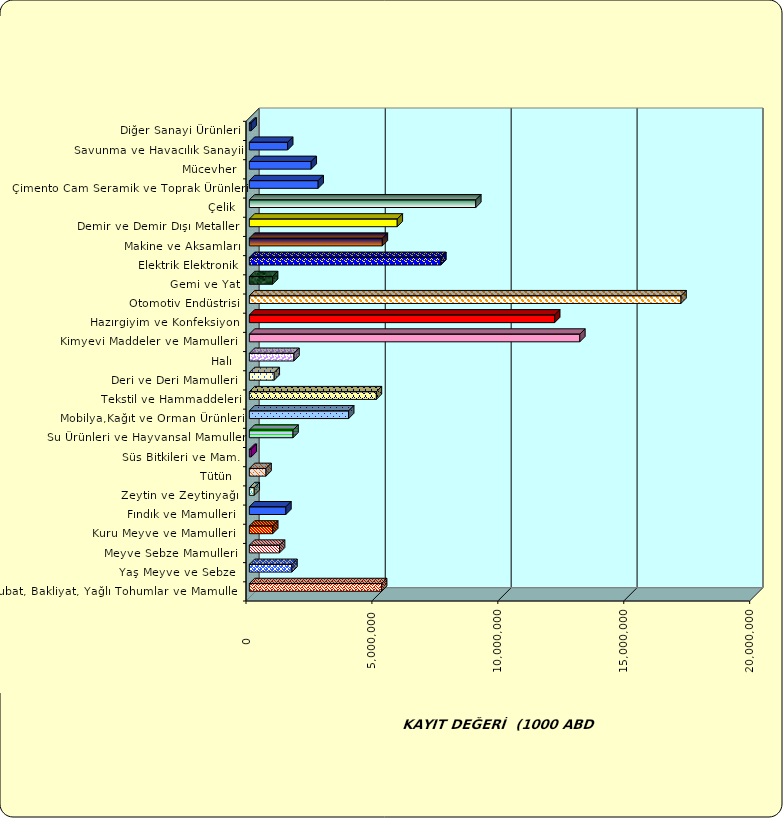
| Category | Series 0 |
|---|---|
|  Hububat, Bakliyat, Yağlı Tohumlar ve Mamulleri  | 5251072.72 |
|  Yaş Meyve ve Sebze   | 1691226.336 |
|  Meyve Sebze Mamulleri  | 1199120.939 |
|  Kuru Meyve ve Mamulleri   | 927738.854 |
|  Fındık ve Mamulleri  | 1450567.712 |
|  Zeytin ve Zeytinyağı  | 193791.801 |
|  Tütün  | 662853.18 |
|  Süs Bitkileri ve Mam. | 76228.022 |
|  Su Ürünleri ve Hayvansal Mamuller | 1734058.544 |
|  Mobilya,Kağıt ve Orman Ürünleri | 3943696.581 |
|  Tekstil ve Hammaddeleri | 5044370.079 |
|  Deri ve Deri Mamulleri  | 988097.893 |
|  Halı  | 1770886.37 |
|  Kimyevi Maddeler ve Mamulleri   | 13122588.965 |
|  Hazırgiyim ve Konfeksiyon  | 12123141.96 |
|  Otomotiv Endüstrisi | 17140579.419 |
|  Gemi ve Yat | 921859.815 |
|  Elektrik Elektronik | 7603913.231 |
|  Makine ve Aksamları | 5280897.239 |
|  Demir ve Demir Dışı Metaller  | 5873409.454 |
|  Çelik | 8991851.668 |
|  Çimento Cam Seramik ve Toprak Ürünleri | 2732217.642 |
|  Mücevher | 2456958.44 |
|  Savunma ve Havacılık Sanayii | 1521396.346 |
|  Diğer Sanayi Ürünleri | 70921.259 |